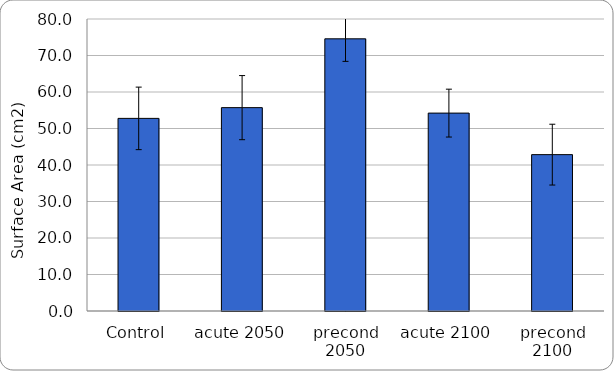
| Category | Series 0 |
|---|---|
| Control | 52.773 |
| acute 2050 | 55.718 |
| precond 2050 | 74.569 |
| acute 2100 | 54.217 |
| precond 2100 | 42.84 |